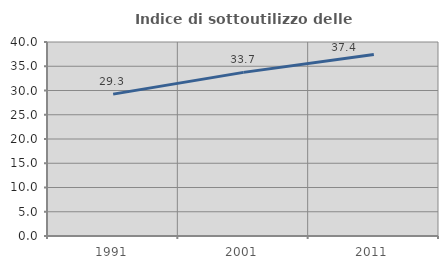
| Category | Indice di sottoutilizzo delle abitazioni  |
|---|---|
| 1991.0 | 29.252 |
| 2001.0 | 33.737 |
| 2011.0 | 37.412 |